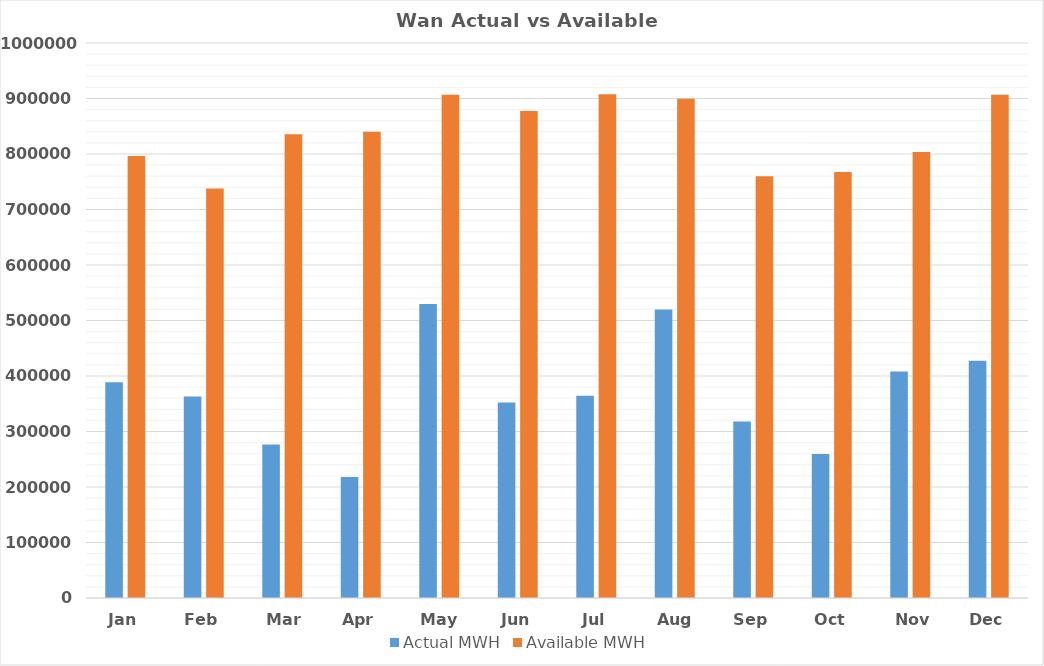
| Category | Actual MWH | Available MWH |
|---|---|---|
| Jan | 388831.3 | 796422.1 |
| Feb | 363089.8 | 737856 |
| Mar | 276667.9 | 835673.16 |
| Apr | 218059.9 | 840122.5 |
| May | 529890 | 906961.42 |
| Jun | 352305.7 | 877637.5 |
| Jul | 364392.6 | 907680 |
| Aug | 519651.4 | 899593.84 |
| Sep | 318085.4 | 759919.7 |
| Oct | 259401.6 | 767383.66 |
| Nov | 408087 | 803612.78 |
| Dec | 427568 | 906956.54 |